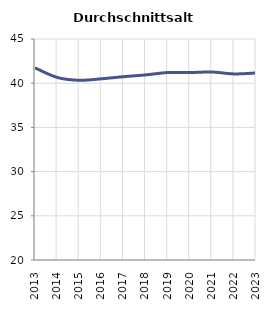
| Category | Durchschnittsalter |
|---|---|
| 2013.0 | 41.736 |
| 2014.0 | 40.653 |
| 2015.0 | 40.33 |
| 2016.0 | 40.497 |
| 2017.0 | 40.736 |
| 2018.0 | 40.938 |
| 2019.0 | 41.203 |
| 2020.0 | 41.2 |
| 2021.0 | 41.268 |
| 2022.0 | 41.05 |
| 2023.0 | 41.156 |